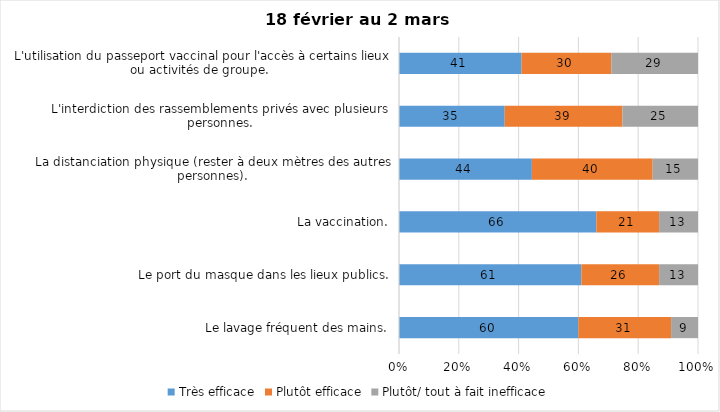
| Category | Très efficace | Plutôt efficace | Plutôt/ tout à fait inefficace |
|---|---|---|---|
| Le lavage fréquent des mains. | 60 | 31 | 9 |
| Le port du masque dans les lieux publics. | 61 | 26 | 13 |
| La vaccination. | 66 | 21 | 13 |
| La distanciation physique (rester à deux mètres des autres personnes). | 44 | 40 | 15 |
| L'interdiction des rassemblements privés avec plusieurs personnes. | 35 | 39 | 25 |
| L'utilisation du passeport vaccinal pour l'accès à certains lieux ou activités de groupe.  | 41 | 30 | 29 |